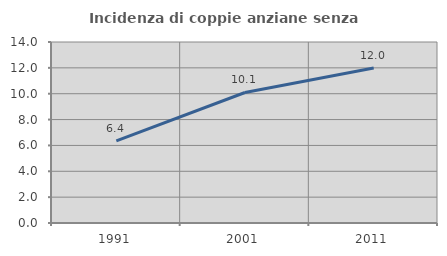
| Category | Incidenza di coppie anziane senza figli  |
|---|---|
| 1991.0 | 6.356 |
| 2001.0 | 10.095 |
| 2011.0 | 11.995 |